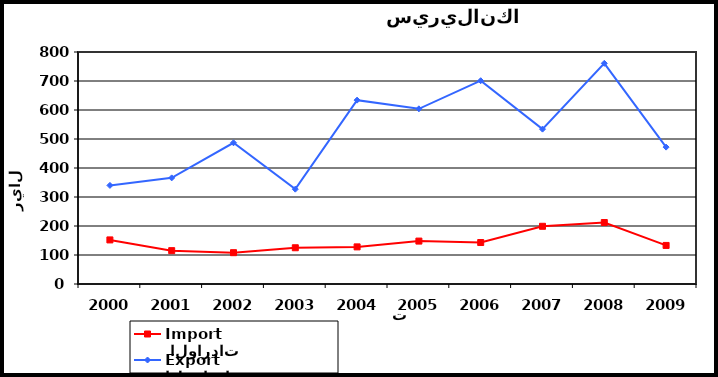
| Category |  الواردات           Import | الصادرات          Export |
|---|---|---|
| 2000.0 | 152 | 340 |
| 2001.0 | 115 | 366 |
| 2002.0 | 108 | 487 |
| 2003.0 | 125 | 327 |
| 2004.0 | 128 | 634 |
| 2005.0 | 148 | 604 |
| 2006.0 | 143 | 701 |
| 2007.0 | 199 | 534 |
| 2008.0 | 212 | 761 |
| 2009.0 | 133 | 472 |